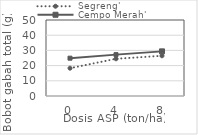
| Category | Segreng' | Cempo Merah' |
|---|---|---|
| 0.0 | 18.29 | 24.88 |
| 4.0 | 24.48 | 27.22 |
| 8.0 | 26.46 | 29.36 |